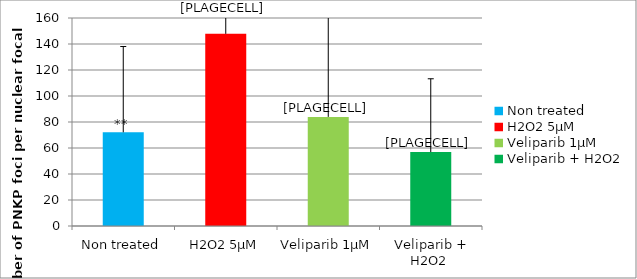
| Category | Series 0 |
|---|---|
| Non treated | 72.07 |
| H2O2 5µM | 147.812 |
| Veliparib 1µM | 83.939 |
| Veliparib + H2O2  | 56.88 |